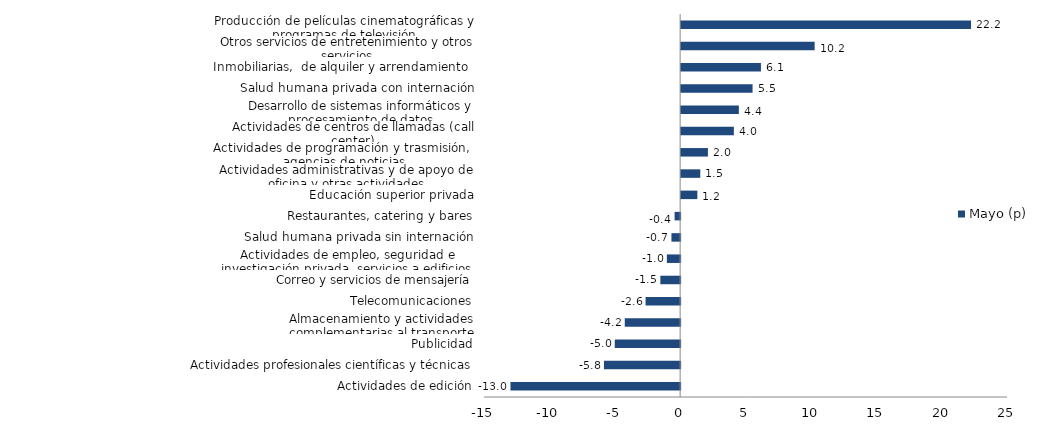
| Category | Mayo (p) |
|---|---|
| Actividades de edición | -12.975 |
| Actividades profesionales científicas y técnicas  | -5.825 |
| Publicidad | -4.999 |
| Almacenamiento y actividades complementarias al transporte | -4.234 |
| Telecomunicaciones | -2.642 |
| Correo y servicios de mensajería | -1.514 |
| Actividades de empleo, seguridad e investigación privada, servicios a edificios | -1.015 |
| Salud humana privada sin internación | -0.665 |
| Restaurantes, catering y bares | -0.423 |
| Educación superior privada | 1.241 |
| Actividades administrativas y de apoyo de oficina y otras actividades | 1.466 |
| Actividades de programación y trasmisión,  agencias de noticias | 2.05 |
| Actividades de centros de llamadas (call center) | 4.034 |
| Desarrollo de sistemas informáticos y procesamiento de datos | 4.414 |
| Salud humana privada con internación | 5.464 |
| Inmobiliarias,  de alquiler y arrendamiento  | 6.105 |
| Otros servicios de entretenimiento y otros servicios | 10.213 |
| Producción de películas cinematográficas y programas de televisión | 22.173 |